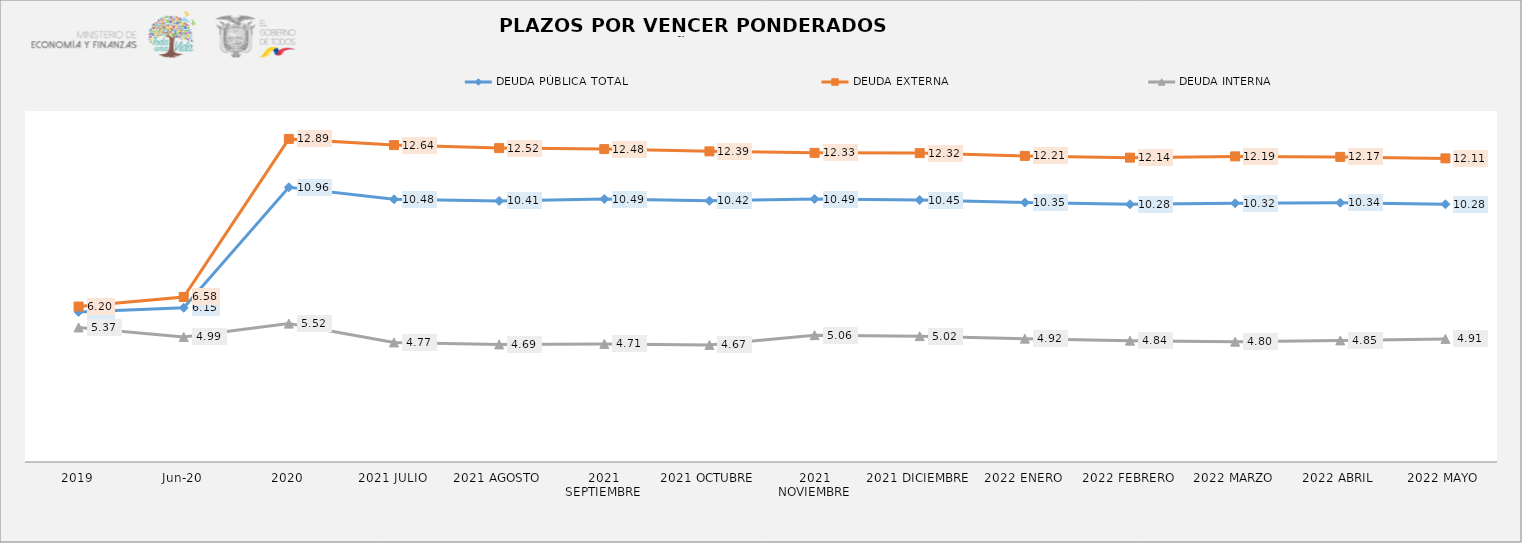
| Category | DEUDA PÚBLICA TOTAL | DEUDA EXTERNA  | DEUDA INTERNA |
|---|---|---|---|
| 2019 | 5.988 | 6.201 | 5.368 |
| jun-20 | 6.152 | 6.581 | 4.989 |
| 2020 | 10.957 | 12.887 | 5.519 |
| 2021 JULIO | 10.48 | 12.64 | 4.77 |
| 2021 AGOSTO | 10.414 | 12.52 | 4.69 |
| 2021 SEPTIEMBRE | 10.49 | 12.48 | 4.71 |
| 2021 OCTUBRE | 10.42 | 12.39 | 4.67 |
| 2021 NOVIEMBRE | 10.49 | 12.33 | 5.06 |
| 2021 DICIEMBRE | 10.45 | 12.32 | 5.02 |
| 2022 ENERO | 10.35 | 12.21 | 4.92 |
| 2022 FEBRERO | 10.28 | 12.14 | 4.84 |
| 2022 MARZO | 10.32 | 12.19 | 4.8 |
| 2022 ABRIL | 10.34 | 12.17 | 4.85 |
| 2022 MAYO | 10.28 | 12.11 | 4.91 |